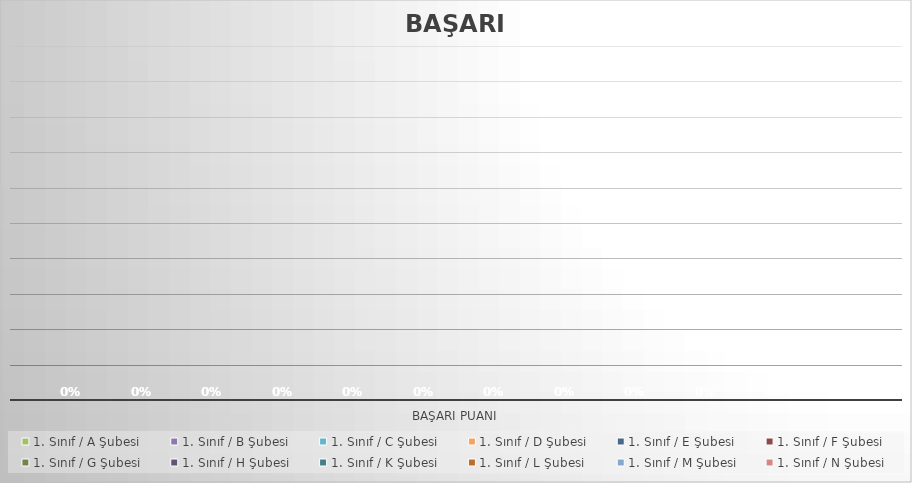
| Category | 1. Sınıf / A Şubesi | 1. Sınıf / B Şubesi | 1. Sınıf / C Şubesi | 1. Sınıf / D Şubesi | 1. Sınıf / E Şubesi | 1. Sınıf / F Şubesi | 1. Sınıf / G Şubesi | 1. Sınıf / H Şubesi | 1. Sınıf / K Şubesi | 1. Sınıf / L Şubesi | 1. Sınıf / M Şubesi | 1. Sınıf / N Şubesi |
|---|---|---|---|---|---|---|---|---|---|---|---|---|
| Başarı Puanı | 0 | 0 | 0 | 0 | 0 | 0 | 0 | 0 | 0 | 0 | 0 | 0 |